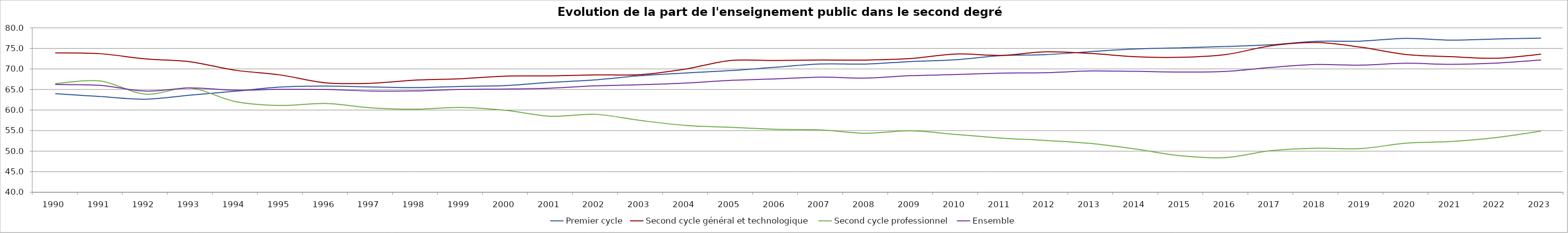
| Category | Premier cycle | Second cycle général et technologique | Second cycle professionnel | Ensemble |
|---|---|---|---|---|
| 1990.0 | 63.999 | 73.897 | 66.418 | 66.217 |
| 1991.0 | 63.28 | 73.701 | 67.076 | 66.007 |
| 1992.0 | 62.64 | 72.436 | 63.874 | 64.611 |
| 1993.0 | 63.62 | 71.728 | 65.336 | 65.387 |
| 1994.0 | 64.578 | 69.683 | 62.055 | 64.825 |
| 1995.0 | 65.58 | 68.535 | 61.11 | 65.041 |
| 1996.0 | 65.822 | 66.626 | 61.6 | 65.002 |
| 1997.0 | 65.628 | 66.508 | 60.551 | 64.632 |
| 1998.0 | 65.472 | 67.274 | 60.204 | 64.638 |
| 1999.0 | 65.747 | 67.602 | 60.64 | 65.012 |
| 2000.0 | 65.941 | 68.252 | 59.942 | 65.105 |
| 2001.0 | 66.726 | 68.311 | 58.501 | 65.319 |
| 2002.0 | 67.352 | 68.556 | 58.958 | 65.885 |
| 2003.0 | 68.36 | 68.614 | 57.46 | 66.162 |
| 2004.0 | 69.008 | 69.969 | 56.256 | 66.561 |
| 2005.0 | 69.595 | 72.048 | 55.804 | 67.224 |
| 2006.0 | 70.416 | 72.044 | 55.315 | 67.572 |
| 2007.0 | 71.202 | 72.178 | 55.162 | 68.017 |
| 2008.0 | 71.185 | 72.156 | 54.36 | 67.768 |
| 2009.0 | 71.79 | 72.533 | 54.96 | 68.355 |
| 2010.0 | 72.231 | 73.626 | 54.067 | 68.631 |
| 2011.0 | 73.23 | 73.297 | 53.179 | 68.974 |
| 2012.0 | 73.478 | 74.159 | 52.611 | 69.082 |
| 2013.0 | 74.21 | 73.767 | 51.867 | 69.511 |
| 2014.0 | 74.852 | 72.955 | 50.501 | 69.413 |
| 2015.0 | 75.127 | 72.835 | 48.88 | 69.256 |
| 2016.0 | 75.453 | 73.507 | 48.435 | 69.402 |
| 2017.0 | 75.884 | 75.623 | 50.122 | 70.359 |
| 2018.0 | 76.702 | 76.424 | 50.705 | 71.077 |
| 2019.0 | 76.768 | 75.287 | 50.629 | 70.926 |
| 2020.0 | 77.428 | 73.497 | 51.948 | 71.379 |
| 2021.0 | 77 | 72.981 | 52.343 | 71.12 |
| 2022.0 | 77.274 | 72.597 | 53.299 | 71.423 |
| 2023.0 | 77.488 | 73.588 | 54.885 | 72.178 |